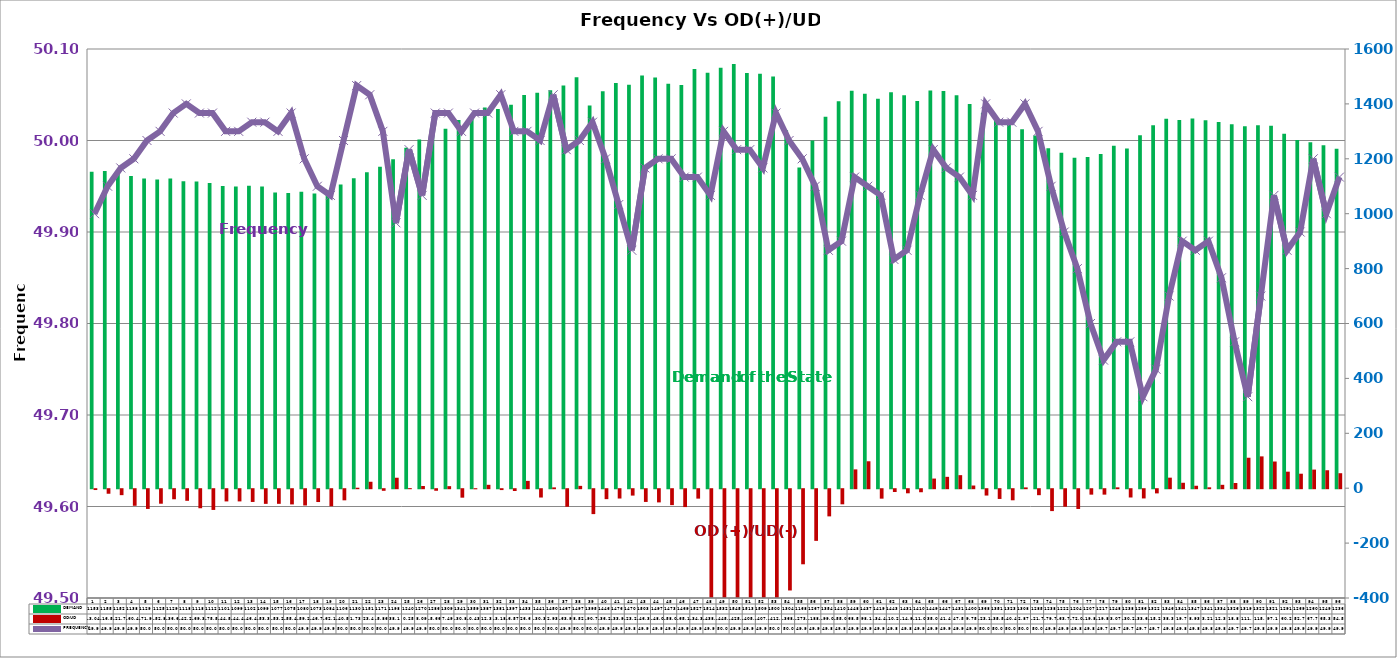
| Category | DEMAND  | OD/UD |
|---|---|---|
| 0 | 1152.75 | -3.04 |
| 1 | 1155.26 | -16.52 |
| 2 | 1152.19 | -21.7 |
| 3 | 1137.69 | -60.41 |
| 4 | 1128.5 | -71.9 |
| 5 | 1124.65 | -52.87 |
| 6 | 1128.57 | -36.67 |
| 7 | 1117.89 | -42.28 |
| 8 | 1117.74 | -69.39 |
| 9 | 1111.63 | -75.54 |
| 10 | 1100.77 | -44.51 |
| 11 | 1099.05 | -44.47 |
| 12 | 1101.82 | -46.47 |
| 13 | 1099.49 | -53.39 |
| 14 | 1077.21 | -53.29 |
| 15 | 1074.98 | -55.44 |
| 16 | 1079.64 | -59.29 |
| 17 | 1073.2 | -46.76 |
| 18 | 1084.08 | -62.1 |
| 19 | 1106.08 | -40.54 |
| 20 | 1129.55 | 1.73 |
| 21 | 1151.06 | 23.49 |
| 22 | 1170.64 | -5.86 |
| 23 | 1198.18 | 38.13 |
| 24 | 1240.17 | 0.25 |
| 25 | 1269.92 | 8.09 |
| 26 | 1286.37 | -5.66 |
| 27 | 1309.02 | 7.49 |
| 28 | 1341.15 | -30.83 |
| 29 | 1358.95 | -0.43 |
| 30 | 1387.33 | 12.37 |
| 31 | 1381.09 | -3.18 |
| 32 | 1396.64 | -6.57 |
| 33 | 1432.73 | 26.67 |
| 34 | 1441.06 | -30.32 |
| 35 | 1449.91 | 2.93 |
| 36 | 1467.38 | -63.97 |
| 37 | 1496.82 | 8.52 |
| 38 | 1394.6 | -90.75 |
| 39 | 1445.74 | -36.23 |
| 40 | 1475.88 | -33.95 |
| 41 | 1469.55 | -23.29 |
| 42 | 1503.05 | -46.38 |
| 43 | 1496.59 | -48.06 |
| 44 | 1473.29 | -58 |
| 45 | 1468.5 | -65.14 |
| 46 | 1527.31 | -34.34 |
| 47 | 1513.65 | -438.64 |
| 48 | 1531.53 | -445.47 |
| 49 | 1544.97 | -425.86 |
| 50 | 1512.85 | -405.2 |
| 51 | 1509.44 | -407.07 |
| 52 | 1499.95 | -412.55 |
| 53 | 1303.56 | -368.93 |
| 54 | 1168.04 | -273.55 |
| 55 | 1266.88 | -188.17 |
| 56 | 1353.6 | -99 |
| 57 | 1409.91 | -55.05 |
| 58 | 1448.28 | 68.53 |
| 59 | 1436.66 | 98.14 |
| 60 | 1418.54 | -34.43 |
| 61 | 1442.86 | -10.26 |
| 62 | 1431.4 | -14.94 |
| 63 | 1410.45 | -11.07 |
| 64 | 1448.59 | 35.09 |
| 65 | 1447.19 | 41.41 |
| 66 | 1431.08 | 47.54 |
| 67 | 1399.57 | 9.75 |
| 68 | 1367.61 | -23.13 |
| 69 | 1350.92 | -35.52 |
| 70 | 1323.06 | -40.4 |
| 71 | 1307.96 | 2.87 |
| 72 | 1284.92 | -21.79 |
| 73 | 1238.31 | -79.76 |
| 74 | 1221.97 | -63.76 |
| 75 | 1204.12 | -72.03 |
| 76 | 1206.68 | -19.83 |
| 77 | 1217.16 | -19.8 |
| 78 | 1247.82 | 3.07 |
| 79 | 1237.5 | -30.21 |
| 80 | 1285.98 | -33.67 |
| 81 | 1322.16 | -15.25 |
| 82 | 1345.65 | 38.36 |
| 83 | 1341.17 | 19.79 |
| 84 | 1346.56 | 8.93 |
| 85 | 1340.55 | 3.21 |
| 86 | 1333.79 | 12.34 |
| 87 | 1325.66 | 18.86 |
| 88 | 1318.9 | 111 |
| 89 | 1322.22 | 115.93 |
| 90 | 1320.66 | 97.19 |
| 91 | 1291.39 | 60.22 |
| 92 | 1268.54 | 52.77 |
| 93 | 1259.85 | 67.76 |
| 94 | 1249.47 | 65.39 |
| 95 | 1236.22 | 54.59 |